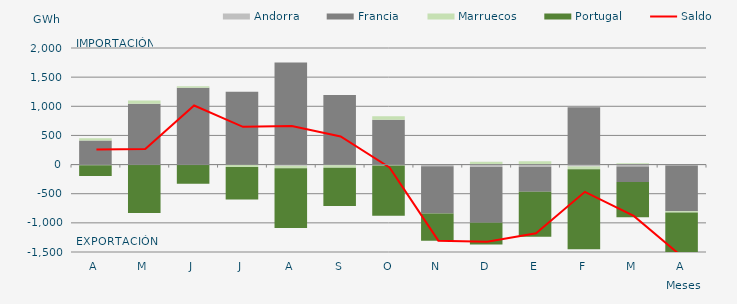
| Category | Andorra | Francia | Marruecos | Portugal |
|---|---|---|---|---|
| A | -12.109 | 414.006 | 37.615 | -182.942 |
| M | 0 | 1041.564 | 58.27 | -830.783 |
| J | -5.126 | 1319.462 | 23.039 | -324.448 |
| J | -3.551 | 1247.95 | -38.635 | -558.283 |
| A | -19.02 | 1750.608 | -45.265 | -1025.301 |
| S | -11.131 | 1193.426 | -45.19 | -654.794 |
| O | -15.195 | 769.066 | 59.008 | -860.78 |
| N | -28.632 | -809.352 | -1.998 | -465.164 |
| D | -40.654 | -959.109 | 48.514 | -372.253 |
| E | -38.484 | -427.138 | 57.119 | -771.475 |
| F | -34.803 | 984.059 | -44.168 | -1373 |
| M | -31.125 | -269.835 | 22.023 | -601.344 |
| A | -16.536 | -782.902 | -22.588 | -764.73 |